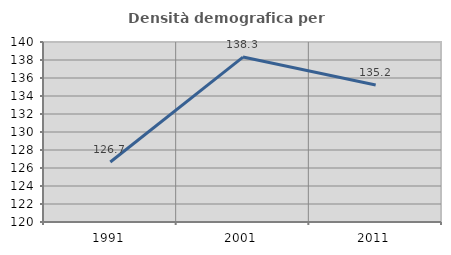
| Category | Densità demografica |
|---|---|
| 1991.0 | 126.671 |
| 2001.0 | 138.327 |
| 2011.0 | 135.229 |